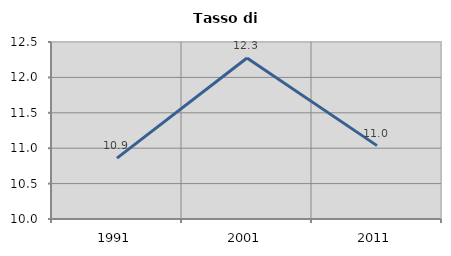
| Category | Tasso di disoccupazione   |
|---|---|
| 1991.0 | 10.86 |
| 2001.0 | 12.274 |
| 2011.0 | 11.036 |